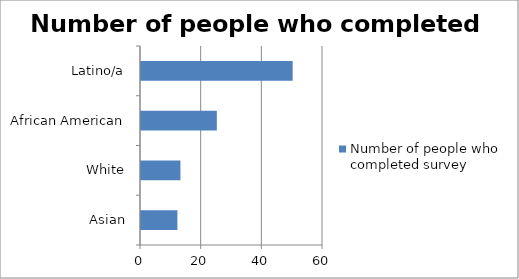
| Category | Number of people who completed survey |
|---|---|
| Asian | 12 |
| White | 13 |
| African American | 25 |
| Latino/a | 50 |